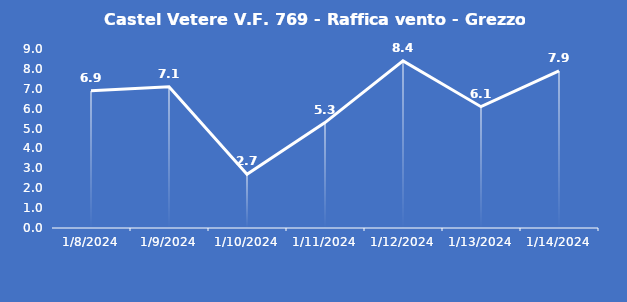
| Category | Castel Vetere V.F. 769 - Raffica vento - Grezzo (m/s) |
|---|---|
| 1/8/24 | 6.9 |
| 1/9/24 | 7.1 |
| 1/10/24 | 2.7 |
| 1/11/24 | 5.3 |
| 1/12/24 | 8.4 |
| 1/13/24 | 6.1 |
| 1/14/24 | 7.9 |